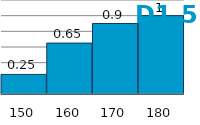
| Category | Series 1 |
|---|---|
| 150.0 | 0.25 |
| 160.0 | 0.65 |
| 170.0 | 0.9 |
| 180.0 | 1 |